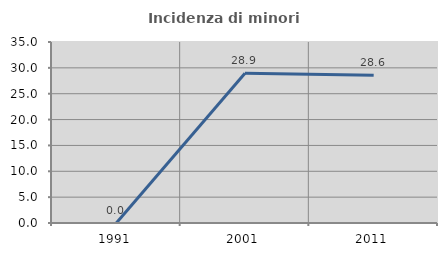
| Category | Incidenza di minori stranieri |
|---|---|
| 1991.0 | 0 |
| 2001.0 | 28.947 |
| 2011.0 | 28.571 |